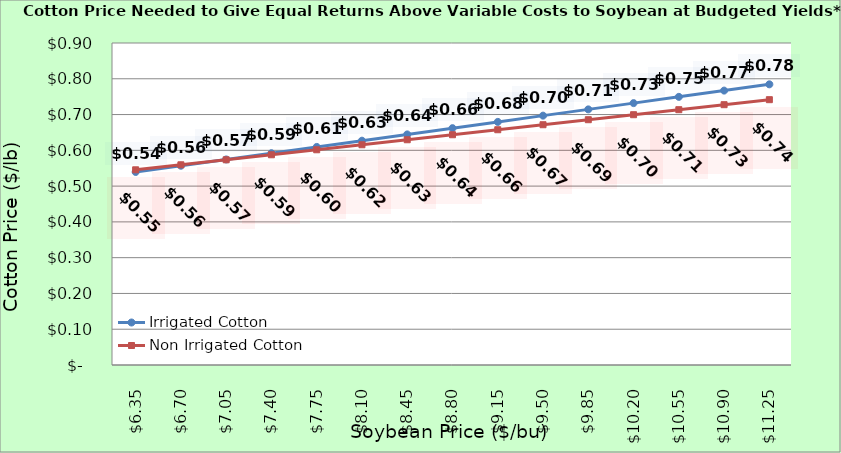
| Category | Irrigated Cotton | Non Irrigated Cotton |
|---|---|---|
| 6.350000000000003 | 0.539 | 0.546 |
| 6.700000000000003 | 0.557 | 0.56 |
| 7.0500000000000025 | 0.574 | 0.574 |
| 7.400000000000002 | 0.592 | 0.588 |
| 7.750000000000002 | 0.609 | 0.602 |
| 8.100000000000001 | 0.627 | 0.616 |
| 8.450000000000001 | 0.644 | 0.63 |
| 8.8 | 0.662 | 0.644 |
| 9.15 | 0.679 | 0.658 |
| 9.5 | 0.697 | 0.672 |
| 9.85 | 0.714 | 0.686 |
| 10.2 | 0.732 | 0.7 |
| 10.549999999999999 | 0.749 | 0.714 |
| 10.899999999999999 | 0.767 | 0.728 |
| 11.249999999999998 | 0.784 | 0.742 |